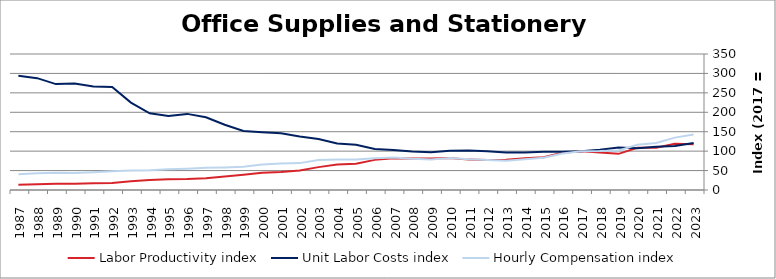
| Category | Labor Productivity index | Unit Labor Costs index | Hourly Compensation index |
|---|---|---|---|
| 2023.0 | 117.738 | 121.216 | 142.717 |
| 2022.0 | 118.849 | 113.384 | 134.755 |
| 2021.0 | 108.585 | 111.592 | 121.173 |
| 2020.0 | 108.428 | 107.162 | 116.194 |
| 2019.0 | 93.042 | 109.337 | 101.73 |
| 2018.0 | 96.636 | 103.66 | 100.172 |
| 2017.0 | 100 | 100 | 100 |
| 2016.0 | 95.673 | 98.235 | 93.984 |
| 2015.0 | 84.262 | 98.462 | 82.967 |
| 2014.0 | 81.616 | 96.729 | 78.947 |
| 2013.0 | 77.821 | 96.825 | 75.35 |
| 2012.0 | 77.156 | 99.998 | 77.155 |
| 2011.0 | 78.177 | 101.383 | 79.258 |
| 2010.0 | 82.067 | 100.712 | 82.652 |
| 2009.0 | 80.916 | 97.287 | 78.72 |
| 2008.0 | 81.128 | 98.996 | 80.313 |
| 2007.0 | 81.603 | 102.652 | 83.766 |
| 2006.0 | 77.549 | 105.63 | 81.915 |
| 2005.0 | 67.325 | 116.243 | 78.261 |
| 2004.0 | 65.356 | 119.929 | 78.381 |
| 2003.0 | 58.882 | 131.472 | 77.413 |
| 2002.0 | 50.289 | 137.579 | 69.188 |
| 2001.0 | 46.546 | 145.862 | 67.893 |
| 2000.0 | 44.227 | 148.635 | 65.737 |
| 1999.0 | 39.538 | 152.052 | 60.118 |
| 1998.0 | 34.62 | 167.829 | 58.102 |
| 1997.0 | 30.451 | 187.209 | 57.007 |
| 1996.0 | 28.013 | 195.881 | 54.871 |
| 1995.0 | 27.945 | 190.753 | 53.307 |
| 1994.0 | 25.602 | 197.494 | 50.563 |
| 1993.0 | 22.238 | 224.904 | 50.013 |
| 1992.0 | 18.279 | 264.898 | 48.42 |
| 1991.0 | 17.1 | 266.425 | 45.559 |
| 1990.0 | 15.949 | 273.921 | 43.687 |
| 1989.0 | 16.245 | 272.505 | 44.268 |
| 1988.0 | 14.949 | 287.83 | 43.026 |
| 1987.0 | 13.741 | 293.944 | 40.39 |